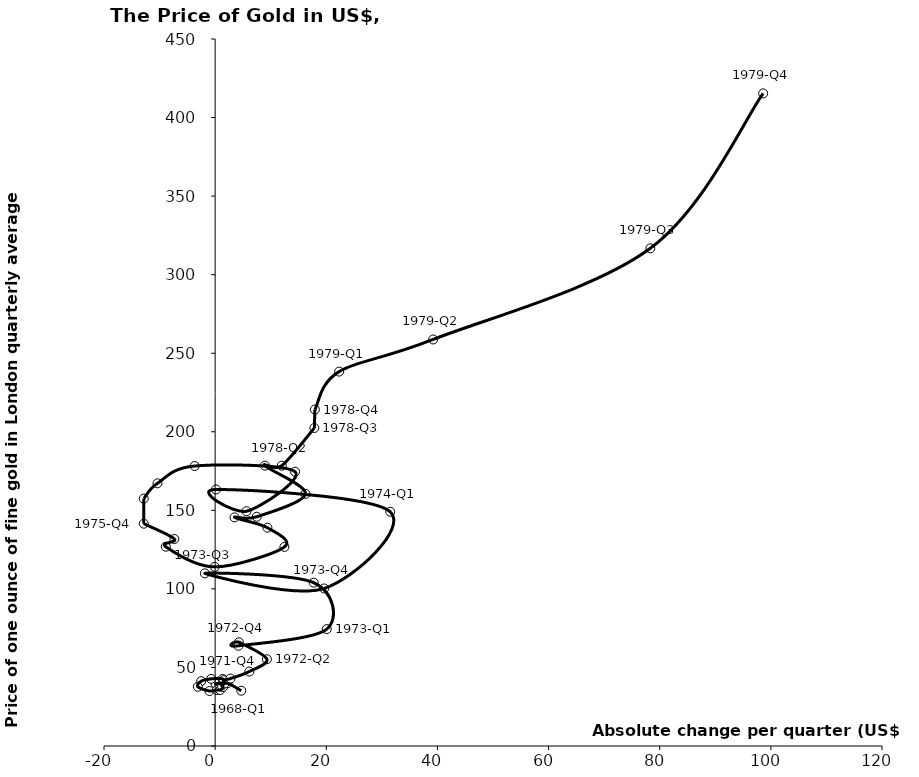
| Category | Series 0 |
|---|---|
| 4.700000000000003 | 35.193 |
| 2.2205000000000013 | 39.893 |
| 0.07299999999999685 | 39.634 |
| 1.529166666666665 | 40.039 |
| 1.3466666666666676 | 42.693 |
| -0.721666666666664 | 42.733 |
| -2.5135000000000005 | 41.249 |
| -3.119833333333336 | 37.706 |
| -1.0165000000000006 | 35.01 |
| 0.31216666666666626 | 35.673 |
| 0.9039999999999999 | 35.634 |
| 1.4258333333333333 | 37.481 |
| 1.1928333333333327 | 38.486 |
| 1.6950000000000003 | 39.866 |
| 1.5284999999999975 | 41.876 |
| 2.7563333333333375 | 42.923 |
| 6.154333333333341 | 47.388 |
| 9.316500000000001 | 55.232 |
| 4.272166666666664 | 66.021 |
| 4.189833333333333 | 63.776 |
| 20.089166666666674 | 74.401 |
| 17.736666666666657 | 103.955 |
| -1.843333333333348 | 109.874 |
| 19.616999999999997 | 100.268 |
| 31.50333333333335 | 149.108 |
| 0.1633333333333269 | 163.275 |
| 5.645833333333314 | 149.435 |
| 14.385833333333352 | 174.566 |
| -3.6816666666666578 | 178.207 |
| -10.379000000000005 | 167.203 |
| -12.845666666666673 | 157.449 |
| -12.83916666666667 | 141.512 |
| -7.338000000000001 | 131.77 |
| -8.881999999999998 | 126.836 |
| -0.06616666666666049 | 114.006 |
| 12.464833333333338 | 126.703 |
| 9.406333333333329 | 138.936 |
| 3.4863333333333344 | 145.516 |
| 7.485333333333344 | 145.909 |
| 16.26866666666666 | 160.487 |
| 8.968999999999994 | 178.446 |
| 11.983000000000004 | 178.425 |
| 17.855833333333337 | 202.412 |
| 17.947999999999993 | 214.136 |
| 22.310500000000005 | 238.308 |
| 39.22933333333333 | 258.757 |
| 78.31183333333334 | 316.767 |
| 98.61433333333338 | 415.381 |